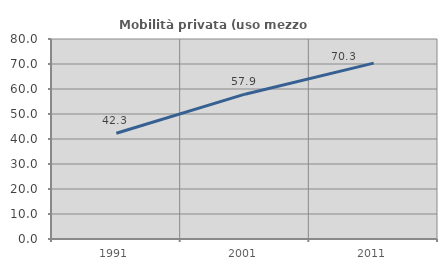
| Category | Mobilità privata (uso mezzo privato) |
|---|---|
| 1991.0 | 42.28 |
| 2001.0 | 57.931 |
| 2011.0 | 70.339 |